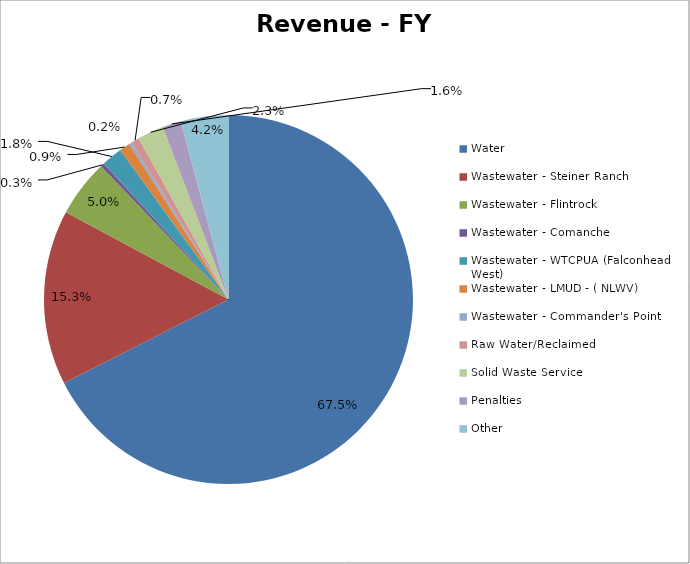
| Category | Series 0 |
|---|---|
| Water | 0.675 |
| Wastewater - Steiner Ranch | 0.153 |
| Wastewater - Flintrock | 0.05 |
| Wastewater - Comanche  | 0.003 |
| Wastewater - WTCPUA (Falconhead West) | 0.018 |
| Wastewater - LMUD - ( NLWV) | 0.009 |
| Wastewater - Commander's Point | 0.002 |
| Raw Water/Reclaimed | 0.007 |
| Solid Waste Service | 0.023 |
| Penalties | 0.016 |
| Other | 0.042 |